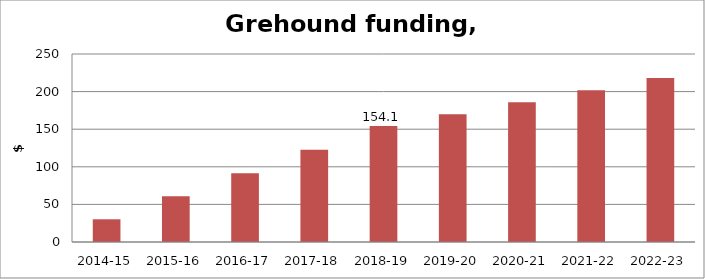
| Category | Series 0 |
|---|---|
| 2014-15 | 30.207 |
| 2015-16 | 60.717 |
| 2016-17 | 91.567 |
| 2017-18 | 122.743 |
| 2018-19 | 154.119 |
| 2019-20 | 169.911 |
| 2020-21 | 185.826 |
| 2021-22 | 201.865 |
| 2022-23 | 218.032 |